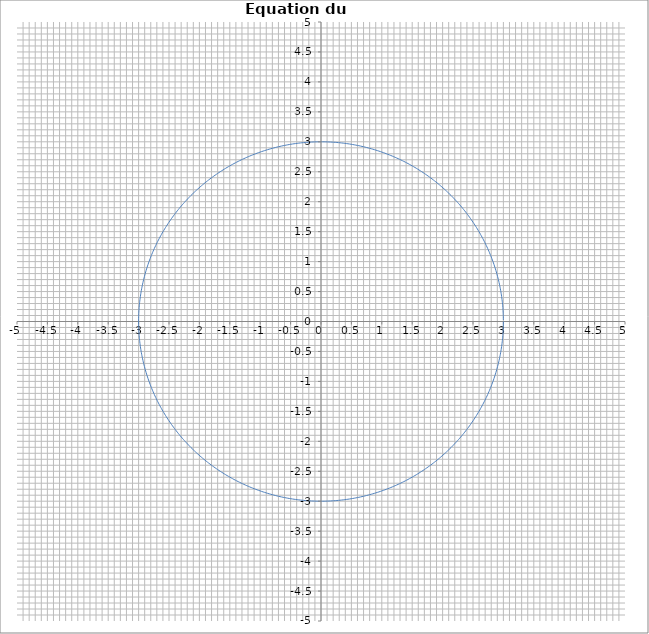
| Category | Series 0 |
|---|---|
| 2.999885769192514 | 0.026 |
| 2.999543085469174 | 0.052 |
| 2.998971974926672 | 0.079 |
| 2.998172481057287 | 0.105 |
| 2.9971446647455733 | 0.131 |
| 2.9958886042637216 | 0.157 |
| 2.994404395265601 | 0.183 |
| 2.9926921507794724 | 0.209 |
| 2.990752001199384 | 0.235 |
| 2.988584094275237 | 0.261 |
| 2.9861885951015363 | 0.288 |
| 2.9835656861048196 | 0.314 |
| 2.9807155670297623 | 0.34 |
| 2.977638454923966 | 0.366 |
| 2.974334584121431 | 0.392 |
| 2.9708042062247113 | 0.418 |
| 2.9670475900857505 | 0.443 |
| 2.9630650217854133 | 0.469 |
| 2.9588568046116945 | 0.495 |
| 2.954423259036624 | 0.521 |
| 2.9497647226918637 | 0.547 |
| 2.944881550342992 | 0.572 |
| 2.9397741138624887 | 0.598 |
| 2.934442802201417 | 0.624 |
| 2.9288880213598 | 0.649 |
| 2.9231101943557056 | 0.675 |
| 2.9171097611930294 | 0.7 |
| 2.9108871788279895 | 0.726 |
| 2.904442921134323 | 0.751 |
| 2.897777478867205 | 0.776 |
| 2.890891359625869 | 0.802 |
| 2.8837850878149567 | 0.827 |
| 2.876459204604579 | 0.852 |
| 2.868914267889106 | 0.877 |
| 2.861150852244681 | 0.902 |
| 2.8531695488854605 | 0.927 |
| 2.844970965618598 | 0.952 |
| 2.8365557267979504 | 0.977 |
| 2.827924473276535 | 1.001 |
| 2.8190778623577253 | 1.026 |
| 2.810016567745193 | 1.051 |
| 2.8007412794916053 | 1.075 |
| 2.791252703946074 | 1.1 |
| 2.7815515637003623 | 1.124 |
| 2.77163859753386 | 1.148 |
| 2.761514560357321 | 1.172 |
| 2.751180223155372 | 1.196 |
| 2.7406363729278027 | 1.22 |
| 2.7298838126296294 | 1.244 |
| 2.7189233611099497 | 1.268 |
| 2.7077558530495818 | 1.292 |
| 2.6963821388975013 | 1.315 |
| 2.6848030848060755 | 1.339 |
| 2.673019572565104 | 1.362 |
| 2.6610324995346653 | 1.385 |
| 2.648842778576781 | 1.408 |
| 2.6364513379858963 | 1.431 |
| 2.623859121418187 | 1.454 |
| 2.6110670878196993 | 1.477 |
| 2.598076211353316 | 1.5 |
| 2.5848874813245777 | 1.523 |
| 2.571501902106337 | 1.545 |
| 2.5579204930622765 | 1.567 |
| 2.544144288469278 | 1.59 |
| 2.530174337438657 | 1.612 |
| 2.516011703836272 | 1.634 |
| 2.5016574662015048 | 1.656 |
| 2.487112717665125 | 1.678 |
| 2.4723785658660473 | 1.699 |
| 2.4574561328669753 | 1.721 |
| 2.4423465550689576 | 1.742 |
| 2.4270509831248424 | 1.763 |
| 2.411570581851652 | 1.784 |
| 2.3959065301418785 | 1.805 |
| 2.3800600208737057 | 1.826 |
| 2.3640322608201663 | 1.847 |
| 2.3478244705572417 | 1.868 |
| 2.3314378843709127 | 1.888 |
| 2.31487375016316 | 1.908 |
| 2.298133329356934 | 1.928 |
| 2.2812178968000927 | 1.948 |
| 2.2641287406683164 | 1.968 |
| 2.2468671623670065 | 1.988 |
| 2.229434476432183 | 2.007 |
| 2.211832010430372 | 2.027 |
| 2.1940611048575116 | 2.046 |
| 2.176123113036863 | 2.065 |
| 2.1580194010159537 | 2.084 |
| 2.1397513474625445 | 2.103 |
| 2.121320343559643 | 2.121 |
| 2.102727792899553 | 2.14 |
| 2.083975111376992 | 2.158 |
| 2.065063727081262 | 2.176 |
| 2.0459950801874953 | 2.194 |
| 2.0267706228469806 | 2.212 |
| 2.0073918190765747 | 2.229 |
| 1.9878601446472124 | 2.247 |
| 1.9681770869715218 | 2.264 |
| 1.9483441449905508 | 2.281 |
| 1.9283628290596182 | 2.298 |
| 1.9082346608332919 | 2.315 |
| 1.8879611731495125 | 2.331 |
| 1.8675439099128588 | 2.348 |
| 1.846984425976975 | 2.364 |
| 1.826284287026162 | 2.38 |
| 1.805445069456145 | 2.396 |
| 1.784468360254024 | 2.412 |
| 1.7633557568774194 | 2.427 |
| 1.7421088671328198 | 2.442 |
| 1.7207293090531386 | 2.457 |
| 1.6992187107744985 | 2.472 |
| 1.6775787104122404 | 2.487 |
| 1.6558109559361749 | 2.502 |
| 1.6339171050450816 | 2.516 |
| 1.6118988250404716 | 2.53 |
| 1.5897577926996147 | 2.544 |
| 1.5674956941478468 | 2.558 |
| 1.5451142247301632 | 2.572 |
| 1.5226150888821126 | 2.585 |
| 1.5000000000000004 | 2.598 |
| 1.4772706803104012 | 2.611 |
| 1.4544288607390112 | 2.624 |
| 1.4314762807788253 | 2.636 |
| 1.4084146883576727 | 2.649 |
| 1.3852458397051022 | 2.661 |
| 1.3619714992186405 | 2.673 |
| 1.338593439329426 | 2.685 |
| 1.3151134403672324 | 2.696 |
| 1.2915332904248857 | 2.708 |
| 1.2678547852220983 | 2.719 |
| 1.2440797279687168 | 2.73 |
| 1.2202099292274007 | 2.741 |
| 1.1962472067757388 | 2.751 |
| 1.1721933854678217 | 2.762 |
| 1.1480502970952695 | 2.772 |
| 1.1238197802477359 | 2.782 |
| 1.099503680172892 | 2.791 |
| 1.075103848635901 | 2.801 |
| 1.0506221437784022 | 2.81 |
| 1.0260604299770064 | 2.819 |
| 1.0014205777013134 | 2.828 |
| 0.9767044633714703 | 2.837 |
| 0.9519139692152763 | 2.845 |
| 0.9270509831248424 | 2.853 |
| 0.9021173985128199 | 2.861 |
| 0.8771151141682103 | 2.869 |
| 0.8520460341117676 | 2.876 |
| 0.8269120674509975 | 2.884 |
| 0.8017151282347709 | 2.891 |
| 0.7764571353075622 | 2.898 |
| 0.7511400121633245 | 2.904 |
| 0.7257656867990037 | 2.911 |
| 0.7003360915677164 | 2.917 |
| 0.6748531630315948 | 2.923 |
| 0.6493188418143088 | 2.929 |
| 0.6237350724532784 | 2.934 |
| 0.5981038032515922 | 2.94 |
| 0.5724269861296347 | 2.945 |
| 0.5467065764764423 | 2.95 |
| 0.5209445330007912 | 2.954 |
| 0.4951428175820335 | 2.959 |
| 0.46930339512069275 | 2.963 |
| 0.4434282333888323 | 2.967 |
| 0.41751930288019706 | 2.971 |
| 0.39157857666015516 | 2.974 |
| 0.36560803021544247 | 2.978 |
| 0.33960964130371984 | 2.981 |
| 0.31358538980296036 | 2.984 |
| 0.28753725756067217 | 2.986 |
| 0.2614672282429744 | 2.989 |
| 0.235377287183535 | 2.991 |
| 0.20926942123237635 | 2.993 |
| 0.18314561860457074 | 2.994 |
| 0.1570078687288319 | 2.996 |
| 0.1308581620960087 | 2.997 |
| 0.10469849010750323 | 2.998 |
| 0.07853084492361942 | 2.999 |
| 0.052357219311850126 | 3 |
| 0.026179606495121688 | 3 |
| 1.83772268236293e-16 | 3 |
| -0.026179606495121327 | 3 |
| -0.05235721931185043 | 3 |
| -0.07853084492361906 | 2.999 |
| -0.1046984901075022 | 2.998 |
| -0.13085816209600767 | 2.997 |
| -0.15700786872883085 | 2.996 |
| -0.18314561860457101 | 2.994 |
| -0.209269421232376 | 2.993 |
| -0.23537728718353462 | 2.991 |
| -0.2614672282429747 | 2.989 |
| -0.28753725756067183 | 2.986 |
| -0.31358538980296 | 2.984 |
| -0.3396096413037201 | 2.981 |
| -0.3656080302154421 | 2.978 |
| -0.39157857666015417 | 2.974 |
| -0.41751930288019606 | 2.971 |
| -0.4434282333888313 | 2.967 |
| -0.4693033951206931 | 2.963 |
| -0.49514281758203316 | 2.959 |
| -0.5209445330007909 | 2.954 |
| -0.5467065764764426 | 2.95 |
| -0.5724269861296344 | 2.945 |
| -0.5981038032515912 | 2.94 |
| -0.6237350724532773 | 2.934 |
| -0.6493188418143083 | 2.929 |
| -0.6748531630315944 | 2.923 |
| -0.7003360915677154 | 2.917 |
| -0.7257656867990033 | 2.911 |
| -0.7511400121633242 | 2.904 |
| -0.7764571353075626 | 2.898 |
| -0.8017151282347705 | 2.891 |
| -0.8269120674509971 | 2.884 |
| -0.8520460341117679 | 2.876 |
| -0.87711511416821 | 2.869 |
| -0.9021173985128188 | 2.861 |
| -0.927050983124842 | 2.853 |
| -0.9519139692152759 | 2.845 |
| -0.9767044633714692 | 2.837 |
| -1.001420577701313 | 2.828 |
| -1.0260604299770062 | 2.819 |
| -1.0506221437784027 | 2.81 |
| -1.0751038486359008 | 2.801 |
| -1.0995036801728917 | 2.791 |
| -1.1238197802477363 | 2.782 |
| -1.1480502970952693 | 2.772 |
| -1.1721933854678208 | 2.762 |
| -1.196247206775738 | 2.751 |
| -1.2202099292274 | 2.741 |
| -1.2440797279687164 | 2.73 |
| -1.267854785222098 | 2.719 |
| -1.2915332904248862 | 2.708 |
| -1.3151134403672327 | 2.696 |
| -1.3385934393294265 | 2.685 |
| -1.36197149921864 | 2.673 |
| -1.3852458397051013 | 2.661 |
| -1.4084146883576716 | 2.649 |
| -1.4314762807788255 | 2.636 |
| -1.454428860739011 | 2.624 |
| -1.477270680310401 | 2.611 |
| -1.4999999999999993 | 2.598 |
| -1.5226150888821128 | 2.585 |
| -1.5451142247301628 | 2.572 |
| -1.5674956941478464 | 2.558 |
| -1.5897577926996145 | 2.544 |
| -1.6118988250404707 | 2.53 |
| -1.6339171050450814 | 2.516 |
| -1.6558109559361744 | 2.502 |
| -1.6775787104122402 | 2.487 |
| -1.6992187107744978 | 2.472 |
| -1.7207293090531375 | 2.457 |
| -1.7421088671328193 | 2.442 |
| -1.7633557568774192 | 2.427 |
| -1.7844683602540234 | 2.412 |
| -1.805445069456145 | 2.396 |
| -1.826284287026162 | 2.38 |
| -1.846984425976975 | 2.364 |
| -1.8675439099128583 | 2.348 |
| -1.8879611731495118 | 2.331 |
| -1.9082346608332912 | 2.315 |
| -1.9283628290596182 | 2.298 |
| -1.9483441449905508 | 2.281 |
| -1.9681770869715225 | 2.264 |
| -1.9878601446472128 | 2.247 |
| -2.0073918190765747 | 2.229 |
| -2.0267706228469806 | 2.212 |
| -2.0459950801874953 | 2.194 |
| -2.0650637270812613 | 2.176 |
| -2.083975111376991 | 2.158 |
| -2.102727792899553 | 2.14 |
| -2.1213203435596424 | 2.121 |
| -2.1397513474625445 | 2.103 |
| -2.1580194010159537 | 2.084 |
| -2.176123113036863 | 2.065 |
| -2.1940611048575116 | 2.046 |
| -2.211832010430372 | 2.027 |
| -2.229434476432182 | 2.007 |
| -2.2468671623670065 | 1.988 |
| -2.264128740668316 | 1.968 |
| -2.2812178968000927 | 1.948 |
| -2.2981333293569337 | 1.928 |
| -2.3148737501631595 | 1.908 |
| -2.331437884370912 | 1.888 |
| -2.3478244705572417 | 1.868 |
| -2.364032260820166 | 1.847 |
| -2.3800600208737057 | 1.826 |
| -2.395906530141879 | 1.805 |
| -2.411570581851652 | 1.784 |
| -2.427050983124842 | 1.763 |
| -2.4423465550689576 | 1.742 |
| -2.457456132866975 | 1.721 |
| -2.4723785658660464 | 1.699 |
| -2.487112717665125 | 1.678 |
| -2.5016574662015043 | 1.656 |
| -2.5160117038362726 | 1.634 |
| -2.530174337438657 | 1.612 |
| -2.544144288469278 | 1.59 |
| -2.5579204930622765 | 1.567 |
| -2.571501902106337 | 1.545 |
| -2.584887481324577 | 1.523 |
| -2.598076211353316 | 1.5 |
| -2.6110670878196993 | 1.477 |
| -2.623859121418187 | 1.454 |
| -2.636451337985896 | 1.431 |
| -2.64884277857678 | 1.408 |
| -2.6610324995346653 | 1.385 |
| -2.6730195725651034 | 1.362 |
| -2.684803084806075 | 1.339 |
| -2.6963821388975013 | 1.315 |
| -2.7077558530495818 | 1.292 |
| -2.7189233611099497 | 1.268 |
| -2.7298838126296294 | 1.244 |
| -2.7406363729278023 | 1.22 |
| -2.7511802231553717 | 1.196 |
| -2.7615145603573206 | 1.172 |
| -2.77163859753386 | 1.148 |
| -2.781551563700362 | 1.124 |
| -2.791252703946074 | 1.1 |
| -2.8007412794916053 | 1.075 |
| -2.8100165677451927 | 1.051 |
| -2.819077862357725 | 1.026 |
| -2.8279244732765347 | 1.001 |
| -2.8365557267979504 | 0.977 |
| -2.844970965618598 | 0.952 |
| -2.8531695488854605 | 0.927 |
| -2.8611508522446805 | 0.902 |
| -2.868914267889106 | 0.877 |
| -2.876459204604579 | 0.852 |
| -2.883785087814956 | 0.827 |
| -2.890891359625869 | 0.802 |
| -2.8977774788672046 | 0.776 |
| -2.904442921134323 | 0.751 |
| -2.9108871788279895 | 0.726 |
| -2.9171097611930294 | 0.7 |
| -2.9231101943557056 | 0.675 |
| -2.9288880213598 | 0.649 |
| -2.934442802201417 | 0.624 |
| -2.939774113862488 | 0.598 |
| -2.944881550342992 | 0.572 |
| -2.9497647226918637 | 0.547 |
| -2.954423259036624 | 0.521 |
| -2.958856804611694 | 0.495 |
| -2.963065021785413 | 0.469 |
| -2.9670475900857505 | 0.443 |
| -2.970804206224711 | 0.418 |
| -2.974334584121431 | 0.392 |
| -2.977638454923966 | 0.366 |
| -2.9807155670297623 | 0.34 |
| -2.9835656861048196 | 0.314 |
| -2.9861885951015363 | 0.288 |
| -2.988584094275237 | 0.261 |
| -2.990752001199384 | 0.235 |
| -2.9926921507794724 | 0.209 |
| -2.994404395265601 | 0.183 |
| -2.9958886042637216 | 0.157 |
| -2.9971446647455733 | 0.131 |
| -2.998172481057287 | 0.105 |
| -2.998971974926672 | 0.079 |
| -2.999543085469174 | 0.052 |
| -2.999885769192514 | 0.026 |
| -3.0 | 0 |
| -2.999885769192514 | -0.026 |
| -2.999543085469174 | -0.052 |
| -2.998971974926672 | -0.079 |
| -2.998172481057287 | -0.105 |
| -2.9971446647455733 | -0.131 |
| -2.9958886042637216 | -0.157 |
| -2.994404395265601 | -0.183 |
| -2.992692150779473 | -0.209 |
| -2.990752001199384 | -0.235 |
| -2.988584094275237 | -0.261 |
| -2.9861885951015363 | -0.288 |
| -2.98356568610482 | -0.314 |
| -2.9807155670297623 | -0.34 |
| -2.977638454923966 | -0.366 |
| -2.9743345841214315 | -0.392 |
| -2.970804206224711 | -0.418 |
| -2.9670475900857505 | -0.443 |
| -2.9630650217854133 | -0.469 |
| -2.9588568046116945 | -0.495 |
| -2.954423259036624 | -0.521 |
| -2.9497647226918637 | -0.547 |
| -2.944881550342992 | -0.572 |
| -2.939774113862489 | -0.598 |
| -2.934442802201417 | -0.624 |
| -2.9288880213598 | -0.649 |
| -2.9231101943557056 | -0.675 |
| -2.9171097611930294 | -0.7 |
| -2.9108871788279895 | -0.726 |
| -2.904442921134323 | -0.751 |
| -2.897777478867205 | -0.776 |
| -2.8908913596258694 | -0.802 |
| -2.8837850878149567 | -0.827 |
| -2.8764592046045796 | -0.852 |
| -2.8689142678891066 | -0.877 |
| -2.861150852244681 | -0.902 |
| -2.8531695488854605 | -0.927 |
| -2.8449709656185984 | -0.952 |
| -2.8365557267979504 | -0.977 |
| -2.8279244732765356 | -1.001 |
| -2.8190778623577253 | -1.026 |
| -2.810016567745193 | -1.051 |
| -2.8007412794916053 | -1.075 |
| -2.791252703946074 | -1.1 |
| -2.7815515637003623 | -1.124 |
| -2.771638597533861 | -1.148 |
| -2.761514560357321 | -1.172 |
| -2.751180223155372 | -1.196 |
| -2.740636372927803 | -1.22 |
| -2.7298838126296294 | -1.244 |
| -2.71892336110995 | -1.268 |
| -2.7077558530495818 | -1.292 |
| -2.6963821388975013 | -1.315 |
| -2.6848030848060755 | -1.339 |
| -2.6730195725651043 | -1.362 |
| -2.6610324995346657 | -1.385 |
| -2.6488427785767805 | -1.408 |
| -2.6364513379858963 | -1.431 |
| -2.6238591214181874 | -1.454 |
| -2.6110670878196993 | -1.477 |
| -2.598076211353316 | -1.5 |
| -2.5848874813245777 | -1.523 |
| -2.571501902106337 | -1.545 |
| -2.557920493062277 | -1.567 |
| -2.544144288469278 | -1.59 |
| -2.5301743374386576 | -1.612 |
| -2.516011703836272 | -1.634 |
| -2.501657466201504 | -1.656 |
| -2.4871127176651253 | -1.678 |
| -2.472378565866047 | -1.699 |
| -2.457456132866976 | -1.721 |
| -2.4423465550689576 | -1.742 |
| -2.427050983124843 | -1.763 |
| -2.4115705818516515 | -1.784 |
| -2.395906530141879 | -1.805 |
| -2.3800600208737057 | -1.826 |
| -2.3640322608201667 | -1.847 |
| -2.347824470557242 | -1.868 |
| -2.3314378843709123 | -1.888 |
| -2.3148737501631604 | -1.908 |
| -2.298133329356934 | -1.928 |
| -2.281217896800093 | -1.948 |
| -2.2641287406683155 | -1.968 |
| -2.2468671623670073 | -1.988 |
| -2.229434476432183 | -2.007 |
| -2.2118320104303733 | -2.027 |
| -2.1940611048575116 | -2.046 |
| -2.1761231130368635 | -2.065 |
| -2.1580194010159532 | -2.084 |
| -2.1397513474625445 | -2.103 |
| -2.121320343559643 | -2.121 |
| -2.1027277928995525 | -2.14 |
| -2.0839751113769927 | -2.158 |
| -2.065063727081262 | -2.176 |
| -2.0459950801874967 | -2.194 |
| -2.026770622846981 | -2.212 |
| -2.0073918190765756 | -2.229 |
| -1.9878601446472124 | -2.247 |
| -1.9681770869715227 | -2.264 |
| -1.9483441449905523 | -2.281 |
| -1.9283628290596184 | -2.298 |
| -1.9082346608332914 | -2.315 |
| -1.8879611731495114 | -2.331 |
| -1.8675439099128588 | -2.348 |
| -1.846984425976974 | -2.364 |
| -1.8262842870261626 | -2.38 |
| -1.8054450694561448 | -2.396 |
| -1.7844683602540252 | -2.412 |
| -1.7633557568774196 | -2.427 |
| -1.742108867132821 | -2.442 |
| -1.720729309053139 | -2.457 |
| -1.6992187107744985 | -2.472 |
| -1.6775787104122417 | -2.487 |
| -1.655810955936175 | -2.502 |
| -1.633917105045081 | -2.516 |
| -1.6118988250404727 | -2.53 |
| -1.589757792699615 | -2.544 |
| -1.5674956941478457 | -2.558 |
| -1.5451142247301635 | -2.572 |
| -1.5226150888821124 | -2.585 |
| -1.5000000000000013 | -2.598 |
| -1.4772706803104017 | -2.611 |
| -1.4544288607390106 | -2.624 |
| -1.431476280778826 | -2.636 |
| -1.4084146883576723 | -2.649 |
| -1.3852458397051033 | -2.661 |
| -1.3619714992186407 | -2.673 |
| -1.3385934393294283 | -2.685 |
| -1.315113440367233 | -2.696 |
| -1.2915332904248853 | -2.708 |
| -1.2678547852220998 | -2.719 |
| -1.2440797279687177 | -2.73 |
| -1.2202099292274002 | -2.741 |
| -1.1962472067757373 | -2.751 |
| -1.1721933854678215 | -2.762 |
| -1.1480502970952684 | -2.772 |
| -1.1238197802477368 | -2.782 |
| -1.0995036801728917 | -2.791 |
| -1.0751038486359021 | -2.801 |
| -1.0506221437784027 | -2.81 |
| -1.0260604299770082 | -2.819 |
| -1.0014205777013137 | -2.828 |
| -0.9767044633714699 | -2.837 |
| -0.9519139692152779 | -2.845 |
| -0.9270509831248427 | -2.853 |
| -0.9021173985128214 | -2.861 |
| -0.8771151141682113 | -2.869 |
| -0.8520460341117679 | -2.876 |
| -0.8269120674509967 | -2.884 |
| -0.8017151282347712 | -2.891 |
| -0.7764571353075619 | -2.898 |
| -0.7511400121633255 | -2.904 |
| -0.7257656867990033 | -2.911 |
| -0.7003360915677155 | -2.917 |
| -0.6748531630315957 | -2.923 |
| -0.6493188418143084 | -2.929 |
| -0.6237350724532793 | -2.934 |
| -0.598103803251592 | -2.94 |
| -0.5724269861296364 | -2.945 |
| -0.5467065764764434 | -2.95 |
| -0.520944533000791 | -2.954 |
| -0.4951428175820345 | -2.959 |
| -0.4693033951206931 | -2.963 |
| -0.4434282333888314 | -2.967 |
| -0.4175193028801948 | -2.971 |
| -0.3915785766601549 | -2.974 |
| -0.3656080302154415 | -2.978 |
| -0.33960964130372084 | -2.981 |
| -0.3135853898029601 | -2.984 |
| -0.2875372575606732 | -2.986 |
| -0.26146722824297475 | -2.989 |
| -0.2353772871835367 | -2.991 |
| -0.20926942123237674 | -2.993 |
| -0.18314561860457307 | -2.994 |
| -0.15700786872883293 | -2.996 |
| -0.1308581620960084 | -2.997 |
| -0.10469849010750495 | -2.998 |
| -0.07853084492362045 | -2.999 |
| -0.05235721931185049 | -3 |
| -0.026179606495120727 | -3 |
| -5.51316804708879e-16 | -3 |
| 0.026179606495122288 | -3 |
| 0.05235721931184939 | -3 |
| 0.07853084492361934 | -2.999 |
| 0.10469849010750384 | -2.998 |
| 0.13085816209600729 | -2.997 |
| 0.15700786872883182 | -2.996 |
| 0.18314561860456932 | -2.994 |
| 0.20926942123237566 | -2.993 |
| 0.23537728718353296 | -2.991 |
| 0.26146722824297364 | -2.989 |
| 0.2875372575606695 | -2.986 |
| 0.31358538980295897 | -2.984 |
| 0.33960964130371973 | -2.981 |
| 0.3656080302154431 | -2.978 |
| 0.3915785766601564 | -2.974 |
| 0.4175193028801964 | -2.971 |
| 0.44342823338883286 | -2.967 |
| 0.469303395120692 | -2.963 |
| 0.4951428175820334 | -2.959 |
| 0.5209445330007899 | -2.954 |
| 0.5467065764764423 | -2.95 |
| 0.5724269861296327 | -2.945 |
| 0.5981038032515908 | -2.94 |
| 0.6237350724532758 | -2.934 |
| 0.6493188418143074 | -2.929 |
| 0.6748531630315948 | -2.923 |
| 0.7003360915677144 | -2.917 |
| 0.7257656867990023 | -2.911 |
| 0.7511400121633243 | -2.904 |
| 0.7764571353075633 | -2.898 |
| 0.8017151282347702 | -2.891 |
| 0.8269120674509982 | -2.884 |
| 0.8520460341117669 | -2.876 |
| 0.8771151141682101 | -2.869 |
| 0.9021173985128179 | -2.861 |
| 0.9270509831248417 | -2.853 |
| 0.9519139692152767 | -2.845 |
| 0.976704463371469 | -2.837 |
| 1.0014205777013128 | -2.828 |
| 1.0260604299770044 | -2.819 |
| 1.0506221437784016 | -2.81 |
| 1.0751038486358986 | -2.801 |
| 1.0995036801728906 | -2.791 |
| 1.1238197802477359 | -2.782 |
| 1.14805029709527 | -2.772 |
| 1.1721933854678204 | -2.762 |
| 1.1962472067757388 | -2.751 |
| 1.2202099292274016 | -2.741 |
| 1.2440797279687168 | -2.73 |
| 1.2678547852220987 | -2.719 |
| 1.2915332904248844 | -2.708 |
| 1.3151134403672322 | -2.696 |
| 1.338593439329425 | -2.685 |
| 1.3619714992186398 | -2.673 |
| 1.3852458397050997 | -2.661 |
| 1.4084146883576714 | -2.649 |
| 1.4314762807788228 | -2.636 |
| 1.4544288607390095 | -2.624 |
| 1.4772706803104008 | -2.611 |
| 1.5000000000000004 | -2.598 |
| 1.5226150888821137 | -2.585 |
| 1.5451142247301624 | -2.572 |
| 1.567495694147847 | -2.558 |
| 1.589757792699614 | -2.544 |
| 1.6118988250404716 | -2.53 |
| 1.63391710504508 | -2.516 |
| 1.655810955936174 | -2.502 |
| 1.6775787104122388 | -2.487 |
| 1.6992187107744976 | -2.472 |
| 1.7207293090531381 | -2.457 |
| 1.742108867132818 | -2.442 |
| 1.7633557568774187 | -2.427 |
| 1.7844683602540221 | -2.412 |
| 1.8054450694561437 | -2.396 |
| 1.8262842870261617 | -2.38 |
| 1.8469844259769754 | -2.364 |
| 1.867543909912858 | -2.348 |
| 1.8879611731495125 | -2.331 |
| 1.9082346608332927 | -2.315 |
| 1.9283628290596178 | -2.298 |
| 1.9483441449905516 | -2.281 |
| 1.9681770869715212 | -2.264 |
| 1.9878601446472124 | -2.247 |
| 2.0073918190765734 | -2.229 |
| 2.02677062284698 | -2.212 |
| 2.045995080187494 | -2.194 |
| 2.0650637270812613 | -2.176 |
| 2.08397511137699 | -2.158 |
| 2.102727792899551 | -2.14 |
| 2.121320343559642 | -2.121 |
| 2.139751347462545 | -2.103 |
| 2.1580194010159524 | -2.084 |
| 2.176123113036863 | -2.065 |
| 2.194061104857512 | -2.046 |
| 2.2118320104303715 | -2.027 |
| 2.229434476432183 | -2.007 |
| 2.2468671623670056 | -1.988 |
| 2.2641287406683155 | -1.968 |
| 2.2812178968000913 | -1.948 |
| 2.2981333293569333 | -1.928 |
| 2.31487375016316 | -1.908 |
| 2.331437884370912 | -1.888 |
| 2.3478244705572413 | -1.868 |
| 2.3640322608201645 | -1.847 |
| 2.380060020873705 | -1.826 |
| 2.3959065301418785 | -1.805 |
| 2.4115705818516524 | -1.784 |
| 2.427050983124842 | -1.763 |
| 2.442346555068958 | -1.742 |
| 2.457456132866975 | -1.721 |
| 2.472378565866047 | -1.699 |
| 2.4871127176651244 | -1.678 |
| 2.5016574662015056 | -1.656 |
| 2.516011703836272 | -1.634 |
| 2.5301743374386563 | -1.612 |
| 2.544144288469276 | -1.59 |
| 2.557920493062277 | -1.567 |
| 2.5715019021063363 | -1.545 |
| 2.584887481324576 | -1.523 |
| 2.598076211353315 | -1.5 |
| 2.611067087819699 | -1.477 |
| 2.6238591214181874 | -1.454 |
| 2.6364513379858954 | -1.431 |
| 2.6488427785767805 | -1.408 |
| 2.6610324995346657 | -1.385 |
| 2.6730195725651034 | -1.362 |
| 2.6848030848060738 | -1.339 |
| 2.6963821388975013 | -1.315 |
| 2.7077558530495818 | -1.292 |
| 2.7189233611099493 | -1.268 |
| 2.7298838126296285 | -1.244 |
| 2.7406363729278027 | -1.22 |
| 2.7511802231553713 | -1.196 |
| 2.7615145603573197 | -1.172 |
| 2.7716385975338604 | -1.148 |
| 2.781551563700362 | -1.124 |
| 2.791252703946074 | -1.1 |
| 2.8007412794916045 | -1.075 |
| 2.8100165677451927 | -1.051 |
| 2.8190778623577253 | -1.026 |
| 2.8279244732765347 | -1.001 |
| 2.8365557267979495 | -0.977 |
| 2.8449709656185984 | -0.952 |
| 2.8531695488854605 | -0.927 |
| 2.86115085224468 | -0.902 |
| 2.868914267889107 | -0.877 |
| 2.876459204604579 | -0.852 |
| 2.883785087814956 | -0.827 |
| 2.890891359625868 | -0.802 |
| 2.897777478867205 | -0.776 |
| 2.904442921134323 | -0.751 |
| 2.9108871788279895 | -0.726 |
| 2.9171097611930294 | -0.7 |
| 2.923110194355705 | -0.675 |
| 2.9288880213598 | -0.649 |
| 2.9344428022014166 | -0.624 |
| 2.939774113862489 | -0.598 |
| 2.944881550342992 | -0.572 |
| 2.9497647226918637 | -0.547 |
| 2.9544232590366235 | -0.521 |
| 2.9588568046116945 | -0.495 |
| 2.963065021785413 | -0.469 |
| 2.96704759008575 | -0.443 |
| 2.970804206224711 | -0.418 |
| 2.974334584121431 | -0.392 |
| 2.977638454923966 | -0.366 |
| 2.9807155670297623 | -0.34 |
| 2.9835656861048196 | -0.314 |
| 2.9861885951015363 | -0.288 |
| 2.988584094275237 | -0.261 |
| 2.990752001199384 | -0.235 |
| 2.992692150779473 | -0.209 |
| 2.994404395265601 | -0.183 |
| 2.9958886042637216 | -0.157 |
| 2.9971446647455733 | -0.131 |
| 2.998172481057287 | -0.105 |
| 2.998971974926672 | -0.079 |
| 2.999543085469174 | -0.052 |
| 2.999885769192514 | -0.026 |
| 3.0 | 0 |